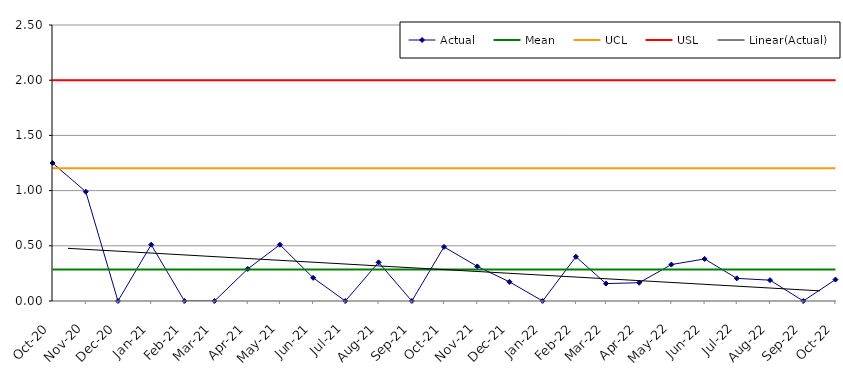
| Category | Actual | Mean | UCL | USL |
|---|---|---|---|---|
| 2020-10-01 | 1.25 | 0.284 | 1.201 | 2 |
| 2020-11-01 | 0.99 | 0.284 | 1.201 | 2 |
| 2020-12-01 | 0 | 0.284 | 1.201 | 2 |
| 2021-01-01 | 0.51 | 0.284 | 1.201 | 2 |
| 2021-02-01 | 0 | 0.284 | 1.201 | 2 |
| 2021-03-01 | 0 | 0.284 | 1.201 | 2 |
| 2021-04-01 | 0.29 | 0.284 | 1.201 | 2 |
| 2021-05-01 | 0.51 | 0.284 | 1.201 | 2 |
| 2021-06-01 | 0.21 | 0.284 | 1.201 | 2 |
| 2021-07-01 | 0 | 0.284 | 1.201 | 2 |
| 2021-08-01 | 0.35 | 0.284 | 1.201 | 2 |
| 2021-09-01 | 0 | 0.284 | 1.201 | 2 |
| 2021-10-01 | 0.49 | 0.284 | 1.201 | 2 |
| 2021-11-01 | 0.313 | 0.284 | 1.201 | 2 |
| 2021-12-01 | 0.174 | 0.284 | 1.201 | 2 |
| 2022-01-01 | 0 | 0.284 | 1.201 | 2 |
| 2022-02-01 | 0.401 | 0.284 | 1.201 | 2 |
| 2022-03-01 | 0.158 | 0.284 | 1.201 | 2 |
| 2022-04-01 | 0.166 | 0.284 | 1.201 | 2 |
| 2022-05-01 | 0.33 | 0.284 | 1.201 | 2 |
| 2022-06-01 | 0.381 | 0.284 | 1.201 | 2 |
| 2022-07-01 | 0.205 | 0.284 | 1.201 | 2 |
| 2022-08-01 | 0.189 | 0.284 | 1.201 | 2 |
| 2022-09-01 | 0 | 0.284 | 1.201 | 2 |
| 2022-10-01 | 0.194 | 0.284 | 1.201 | 2 |